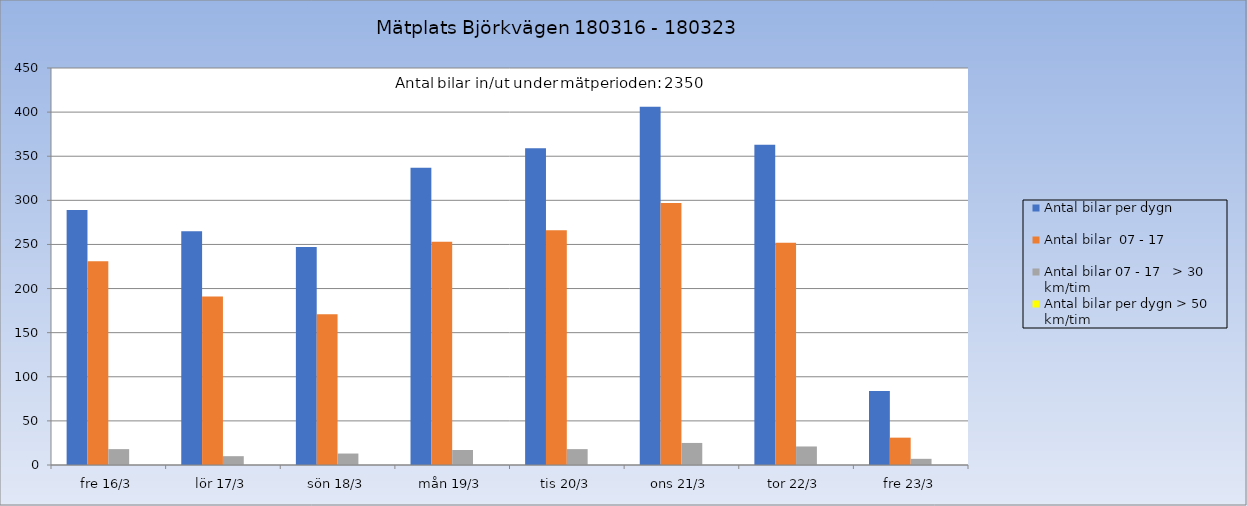
| Category | Antal bilar per dygn | Antal bilar  07 - 17 | Antal bilar 07 - 17   > 30 km/tim | Antal bilar per dygn > 50 km/tim |
|---|---|---|---|---|
| fre 16/3 | 289 | 231 | 18 | 0 |
| lör 17/3 | 265 | 191 | 10 | 0 |
| sön 18/3 | 247 | 171 | 13 | 0 |
| mån 19/3 | 337 | 253 | 17 | 0 |
| tis 20/3 | 359 | 266 | 18 | 0 |
| ons 21/3 | 406 | 297 | 25 | 0 |
| tor 22/3 | 363 | 252 | 21 | 0 |
| fre 23/3 | 84 | 31 | 7 | 0 |